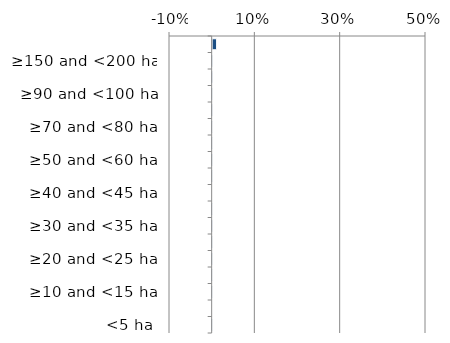
| Category | Not determinable |
|---|---|
| <5 ha | 0 |
| ≥5 and <10 ha | 0 |
| ≥10 and <15 ha | 0 |
| ≥15 and <20 ha | 0 |
| ≥20 and <25 ha | 0 |
| ≥25 and <30 ha | 0 |
| ≥30 and <35 ha | 0 |
| ≥35 and <40 ha | 0 |
| ≥40 and <45 ha | 0 |
| ≥45 and <50 ha | 0 |
| ≥50 and <60 ha | 0 |
| ≥60 and <70 ha | 0 |
| ≥70 and <80 ha | 0 |
| ≥80 and <90 ha | 0 |
| ≥90 and <100 ha | 0 |
| ≥100 and <150 ha | 0 |
| ≥150 and <200 ha | 0 |
| ≥200 ha | 0.009 |